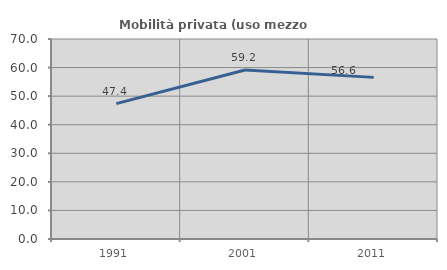
| Category | Mobilità privata (uso mezzo privato) |
|---|---|
| 1991.0 | 47.375 |
| 2001.0 | 59.164 |
| 2011.0 | 56.568 |